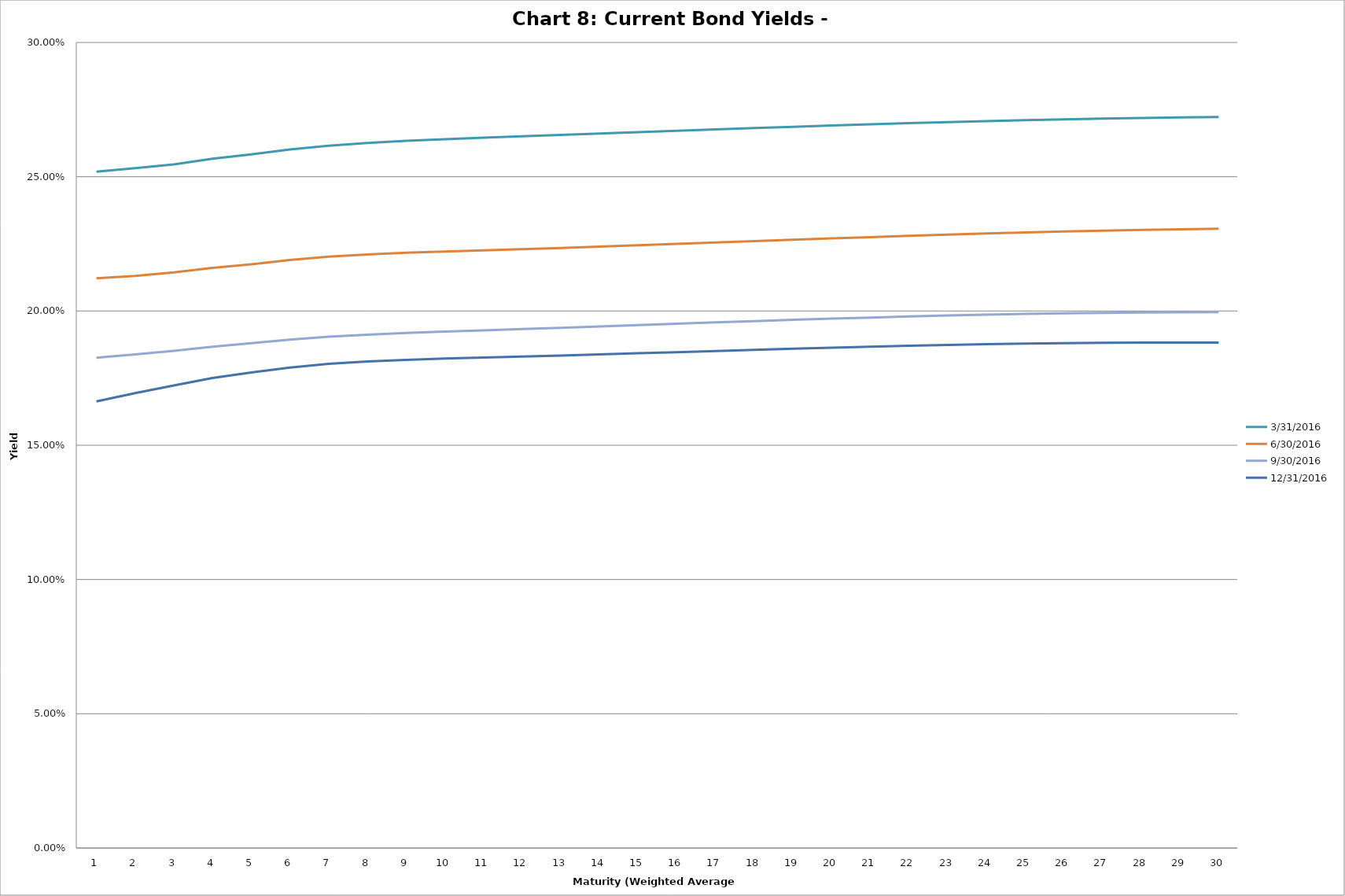
| Category | 3/31/2016 | 6/30/2016 | 9/30/2016 | 12/31/2016 |
|---|---|---|---|---|
| 0 | 0.252 | 0.212 | 0.183 | 0.166 |
| 1 | 0.253 | 0.213 | 0.184 | 0.169 |
| 2 | 0.255 | 0.214 | 0.185 | 0.172 |
| 3 | 0.257 | 0.216 | 0.187 | 0.175 |
| 4 | 0.258 | 0.217 | 0.188 | 0.177 |
| 5 | 0.26 | 0.219 | 0.189 | 0.179 |
| 6 | 0.262 | 0.22 | 0.19 | 0.18 |
| 7 | 0.263 | 0.221 | 0.191 | 0.181 |
| 8 | 0.263 | 0.222 | 0.192 | 0.182 |
| 9 | 0.264 | 0.222 | 0.192 | 0.182 |
| 10 | 0.265 | 0.223 | 0.193 | 0.183 |
| 11 | 0.265 | 0.223 | 0.193 | 0.183 |
| 12 | 0.266 | 0.223 | 0.194 | 0.183 |
| 13 | 0.266 | 0.224 | 0.194 | 0.184 |
| 14 | 0.267 | 0.224 | 0.195 | 0.184 |
| 15 | 0.267 | 0.225 | 0.195 | 0.185 |
| 16 | 0.268 | 0.226 | 0.196 | 0.185 |
| 17 | 0.268 | 0.226 | 0.196 | 0.186 |
| 18 | 0.269 | 0.227 | 0.197 | 0.186 |
| 19 | 0.269 | 0.227 | 0.197 | 0.186 |
| 20 | 0.27 | 0.228 | 0.198 | 0.187 |
| 21 | 0.27 | 0.228 | 0.198 | 0.187 |
| 22 | 0.27 | 0.228 | 0.198 | 0.187 |
| 23 | 0.271 | 0.229 | 0.199 | 0.188 |
| 24 | 0.271 | 0.229 | 0.199 | 0.188 |
| 25 | 0.271 | 0.23 | 0.199 | 0.188 |
| 26 | 0.272 | 0.23 | 0.199 | 0.188 |
| 27 | 0.272 | 0.23 | 0.199 | 0.188 |
| 28 | 0.272 | 0.23 | 0.2 | 0.188 |
| 29 | 0.272 | 0.231 | 0.2 | 0.188 |